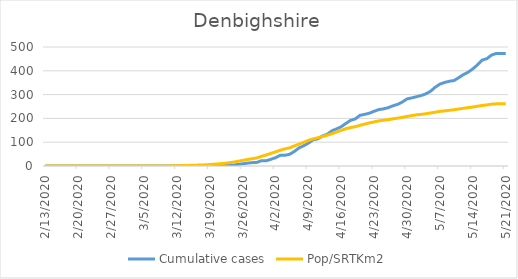
| Category | Cumulative cases | Pop/SRTKm2 |
|---|---|---|
| 5/21/20 | 473 | 261.207 |
| 5/20/20 | 473 | 261.207 |
| 5/19/20 | 473 | 261.146 |
| 5/18/20 | 466 | 259.714 |
| 5/17/20 | 451 | 256.667 |
| 5/16/20 | 445 | 254.396 |
| 5/15/20 | 425 | 251.206 |
| 5/14/20 | 408 | 247.667 |
| 5/13/20 | 394 | 245.213 |
| 5/12/20 | 384 | 242.39 |
| 5/11/20 | 371 | 239.588 |
| 5/10/20 | 359 | 236.111 |
| 5/9/20 | 356 | 234.086 |
| 5/8/20 | 351 | 231.55 |
| 5/7/20 | 344 | 229.505 |
| 5/6/20 | 331 | 226.13 |
| 5/5/20 | 314 | 222.755 |
| 5/4/20 | 303 | 219.503 |
| 5/3/20 | 296 | 216.885 |
| 5/2/20 | 291 | 214.963 |
| 5/1/20 | 286 | 211.547 |
| 4/30/20 | 282 | 208.315 |
| 4/29/20 | 269 | 204.388 |
| 4/28/20 | 259 | 201.055 |
| 4/27/20 | 253 | 198.068 |
| 4/26/20 | 245 | 194.714 |
| 4/25/20 | 240 | 192.28 |
| 4/24/20 | 237 | 189.519 |
| 4/23/20 | 230 | 185.285 |
| 4/22/20 | 222 | 181.235 |
| 4/21/20 | 217 | 176.102 |
| 4/20/20 | 213 | 170.927 |
| 4/19/20 | 198 | 165.302 |
| 4/18/20 | 192 | 161.662 |
| 4/17/20 | 179 | 156.692 |
| 4/16/20 | 165 | 150.106 |
| 4/15/20 | 156 | 142.763 |
| 4/14/20 | 148 | 135.502 |
| 4/13/20 | 133 | 129.162 |
| 4/12/20 | 126 | 123.701 |
| 4/11/20 | 114 | 118.731 |
| 4/10/20 | 110 | 113.74 |
| 4/9/20 | 96 | 107.604 |
| 4/8/20 | 85 | 99.627 |
| 4/7/20 | 76 | 91.794 |
| 4/6/20 | 61 | 84.103 |
| 4/5/20 | 49 | 76.352 |
| 4/4/20 | 45 | 71.831 |
| 4/3/20 | 45 | 66.084 |
| 4/2/20 | 35 | 59.457 |
| 4/1/20 | 28 | 52.646 |
| 3/31/20 | 22 | 46.101 |
| 3/30/20 | 22 | 40.559 |
| 3/29/20 | 15 | 33.727 |
| 3/28/20 | 14 | 30.537 |
| 3/27/20 | 12 | 27.141 |
| 3/26/20 | 9 | 23.358 |
| 3/25/20 | 7 | 19.799 |
| 3/24/20 | 3 | 16.056 |
| 3/23/20 | 3 | 13.295 |
| 3/22/20 | 2 | 10.636 |
| 3/21/20 | 1 | 9.081 |
| 3/20/20 | 0 | 7.547 |
| 3/19/20 | 0 | 6.075 |
| 3/18/20 | 0 | 4.847 |
| 3/17/20 | 0 | 4.132 |
| 3/16/20 | 0 | 3.375 |
| 3/15/20 | 0 | 2.679 |
| 3/14/20 | 0 | 2.086 |
| 3/13/20 | 0 | 1.698 |
| 3/12/20 | 0 | 1.145 |
| 3/11/20 | 0 | 0.655 |
| 3/10/20 | 0 | 0.368 |
| 3/9/20 | 0 | 0.143 |
| 3/8/20 | 0 | 0.082 |
| 3/7/20 | 0 | 0.082 |
| 3/6/20 | 0 | 0.041 |
| 3/5/20 | 0 | 0.041 |
| 3/4/20 | 0 | 0.041 |
| 3/3/20 | 0 | 0.02 |
| 3/2/20 | 0 | 0.02 |
| 3/1/20 | 0 | 0.02 |
| 2/29/20 | 0 | 0.02 |
| 2/28/20 | 0 | 0.02 |
| 2/27/20 | 0 | 0.02 |
| 2/26/20 | 0 | 0 |
| 2/25/20 | 0 | 0 |
| 2/24/20 | 0 | 0 |
| 2/23/20 | 0 | 0 |
| 2/22/20 | 0 | 0 |
| 2/21/20 | 0 | 0 |
| 2/20/20 | 0 | 0 |
| 2/19/20 | 0 | 0 |
| 2/18/20 | 0 | 0 |
| 2/17/20 | 0 | 0 |
| 2/16/20 | 0 | 0 |
| 2/15/20 | 0 | 0 |
| 2/14/20 | 0 | 0 |
| 2/13/20 | 0 | 0 |